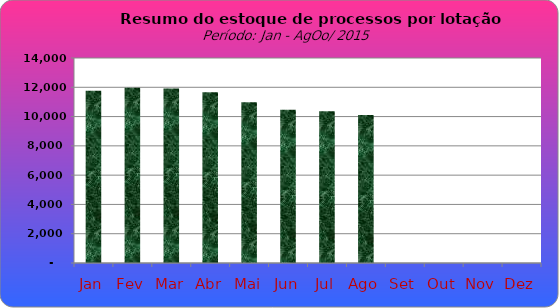
| Category | Series 0 |
|---|---|
| Jan | 11768 |
| Fev | 11973 |
| Mar | 11918 |
| Abr | 11669 |
| Mai | 10977 |
| Jun | 10462 |
| Jul | 10364 |
| Ago | 10110 |
| Set | 0 |
| Out | 0 |
| Nov | 0 |
| Dez | 0 |